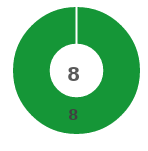
| Category | Series 0 |
|---|---|
| 0 | 8 |
| 1 | 0 |
| 2 | 0 |
| 3 | 0 |
| 4 | 0 |